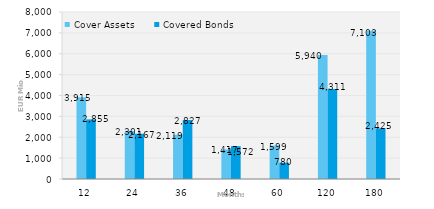
| Category | Cover Assets | Covered Bonds |
|---|---|---|
| 12.0 | 3914.907 | 2854.524 |
| 24.0 | 2301.213 | 2166.792 |
| 36.0 | 2119.177 | 2827.43 |
| 48.0 | 1417.18 | 1572.402 |
| 60.0 | 1598.863 | 779.758 |
| 120.0 | 5939.696 | 4310.754 |
| 180.0 | 7102.962 | 2424.986 |